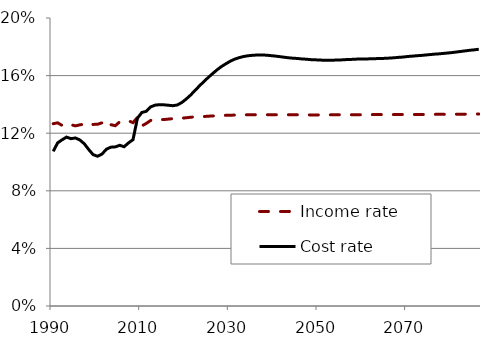
| Category | Income rate | Cost rate |
|---|---|---|
| 1990.0 | 0.127 | 0.107 |
| 1991.0 | 0.127 | 0.113 |
| 1992.0 | 0.125 | 0.115 |
| 1993.0 | 0.124 | 0.117 |
| 1994.0 | 0.126 | 0.116 |
| 1995.0 | 0.125 | 0.117 |
| 1996.0 | 0.126 | 0.115 |
| 1997.0 | 0.126 | 0.113 |
| 1998.0 | 0.125 | 0.109 |
| 1999.0 | 0.126 | 0.105 |
| 2000.0 | 0.126 | 0.104 |
| 2001.0 | 0.127 | 0.106 |
| 2002.0 | 0.129 | 0.109 |
| 2003.0 | 0.126 | 0.11 |
| 2004.0 | 0.125 | 0.11 |
| 2005.0 | 0.128 | 0.112 |
| 2006.0 | 0.128 | 0.111 |
| 2007.0 | 0.129 | 0.113 |
| 2008.0 | 0.127 | 0.116 |
| 2009.0 | 0.131 | 0.13 |
| 2010.0 | 0.125 | 0.134 |
| 2011.0 | 0.127 | 0.135 |
| 2012.0 | 0.129 | 0.138 |
| 2013.0 | 0.128 | 0.139 |
| 2014.0 | 0.129 | 0.14 |
| 2015.0 | 0.13 | 0.14 |
| 2016.0 | 0.13 | 0.139 |
| 2017.0 | 0.13 | 0.139 |
| 2018.0 | 0.13 | 0.14 |
| 2019.0 | 0.13 | 0.141 |
| 2020.0 | 0.131 | 0.144 |
| 2021.0 | 0.131 | 0.146 |
| 2022.0 | 0.131 | 0.15 |
| 2023.0 | 0.132 | 0.153 |
| 2024.0 | 0.132 | 0.156 |
| 2025.0 | 0.132 | 0.159 |
| 2026.0 | 0.132 | 0.161 |
| 2027.0 | 0.132 | 0.164 |
| 2028.0 | 0.132 | 0.166 |
| 2029.0 | 0.132 | 0.168 |
| 2030.0 | 0.132 | 0.17 |
| 2031.0 | 0.133 | 0.172 |
| 2032.0 | 0.133 | 0.172 |
| 2033.0 | 0.133 | 0.173 |
| 2034.0 | 0.133 | 0.174 |
| 2035.0 | 0.133 | 0.174 |
| 2036.0 | 0.133 | 0.174 |
| 2037.0 | 0.133 | 0.174 |
| 2038.0 | 0.133 | 0.174 |
| 2039.0 | 0.133 | 0.174 |
| 2040.0 | 0.133 | 0.174 |
| 2041.0 | 0.133 | 0.173 |
| 2042.0 | 0.133 | 0.173 |
| 2043.0 | 0.133 | 0.172 |
| 2044.0 | 0.133 | 0.172 |
| 2045.0 | 0.133 | 0.172 |
| 2046.0 | 0.133 | 0.172 |
| 2047.0 | 0.133 | 0.171 |
| 2048.0 | 0.133 | 0.171 |
| 2049.0 | 0.133 | 0.171 |
| 2050.0 | 0.133 | 0.171 |
| 2051.0 | 0.133 | 0.171 |
| 2052.0 | 0.133 | 0.171 |
| 2053.0 | 0.133 | 0.171 |
| 2054.0 | 0.133 | 0.171 |
| 2055.0 | 0.133 | 0.171 |
| 2056.0 | 0.133 | 0.171 |
| 2057.0 | 0.133 | 0.171 |
| 2058.0 | 0.133 | 0.171 |
| 2059.0 | 0.133 | 0.172 |
| 2060.0 | 0.133 | 0.172 |
| 2061.0 | 0.133 | 0.172 |
| 2062.0 | 0.133 | 0.172 |
| 2063.0 | 0.133 | 0.172 |
| 2064.0 | 0.133 | 0.172 |
| 2065.0 | 0.133 | 0.172 |
| 2066.0 | 0.133 | 0.172 |
| 2067.0 | 0.133 | 0.172 |
| 2068.0 | 0.133 | 0.173 |
| 2069.0 | 0.133 | 0.173 |
| 2070.0 | 0.133 | 0.173 |
| 2071.0 | 0.133 | 0.174 |
| 2072.0 | 0.133 | 0.174 |
| 2073.0 | 0.133 | 0.174 |
| 2074.0 | 0.133 | 0.174 |
| 2075.0 | 0.133 | 0.175 |
| 2076.0 | 0.133 | 0.175 |
| 2077.0 | 0.133 | 0.175 |
| 2078.0 | 0.133 | 0.175 |
| 2079.0 | 0.133 | 0.176 |
| 2080.0 | 0.133 | 0.176 |
| 2081.0 | 0.133 | 0.176 |
| 2082.0 | 0.133 | 0.177 |
| 2083.0 | 0.133 | 0.177 |
| 2084.0 | 0.133 | 0.178 |
| 2085.0 | 0.133 | 0.178 |
| 2086.0 | 0.133 | 0.178 |